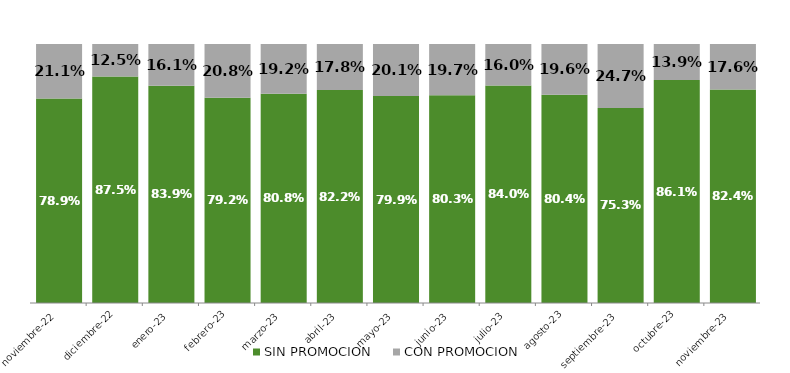
| Category | SIN PROMOCION   | CON PROMOCION   |
|---|---|---|
| 2022-11-01 | 0.789 | 0.211 |
| 2022-12-01 | 0.875 | 0.125 |
| 2023-01-01 | 0.839 | 0.161 |
| 2023-02-01 | 0.792 | 0.208 |
| 2023-03-01 | 0.808 | 0.192 |
| 2023-04-01 | 0.822 | 0.178 |
| 2023-05-01 | 0.799 | 0.201 |
| 2023-06-01 | 0.803 | 0.197 |
| 2023-07-01 | 0.84 | 0.16 |
| 2023-08-01 | 0.804 | 0.196 |
| 2023-09-01 | 0.753 | 0.247 |
| 2023-10-01 | 0.861 | 0.139 |
| 2023-11-01 | 0.824 | 0.176 |